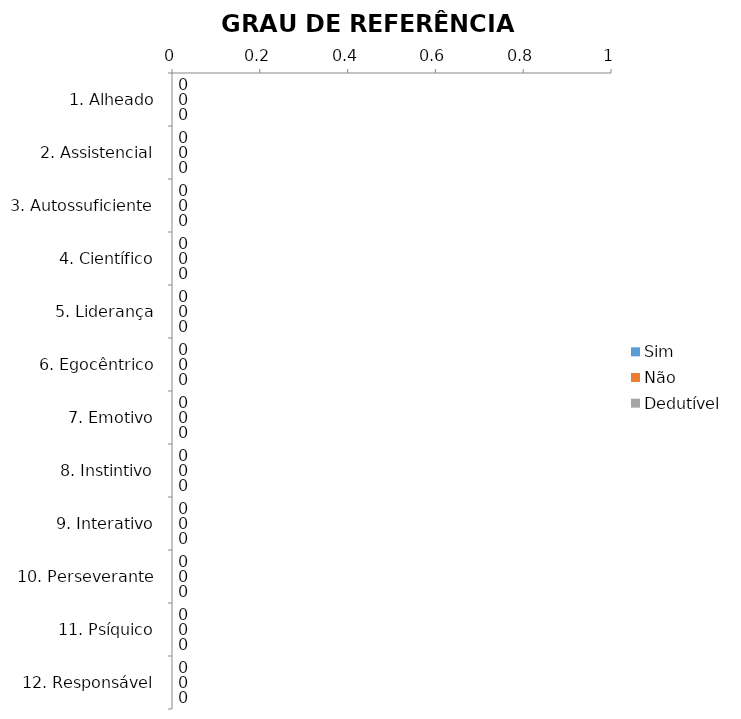
| Category | Sim | Não | Dedutível |
|---|---|---|---|
| 1. Alheado | 0 | 0 | 0 |
| 2. Assistencial | 0 | 0 | 0 |
| 3. Autossuficiente | 0 | 0 | 0 |
| 4. Científico | 0 | 0 | 0 |
| 5. Liderança | 0 | 0 | 0 |
| 6. Egocêntrico | 0 | 0 | 0 |
| 7. Emotivo | 0 | 0 | 0 |
| 8. Instintivo | 0 | 0 | 0 |
| 9. Interativo | 0 | 0 | 0 |
| 10. Perseverante | 0 | 0 | 0 |
| 11. Psíquico | 0 | 0 | 0 |
| 12. Responsável | 0 | 0 | 0 |